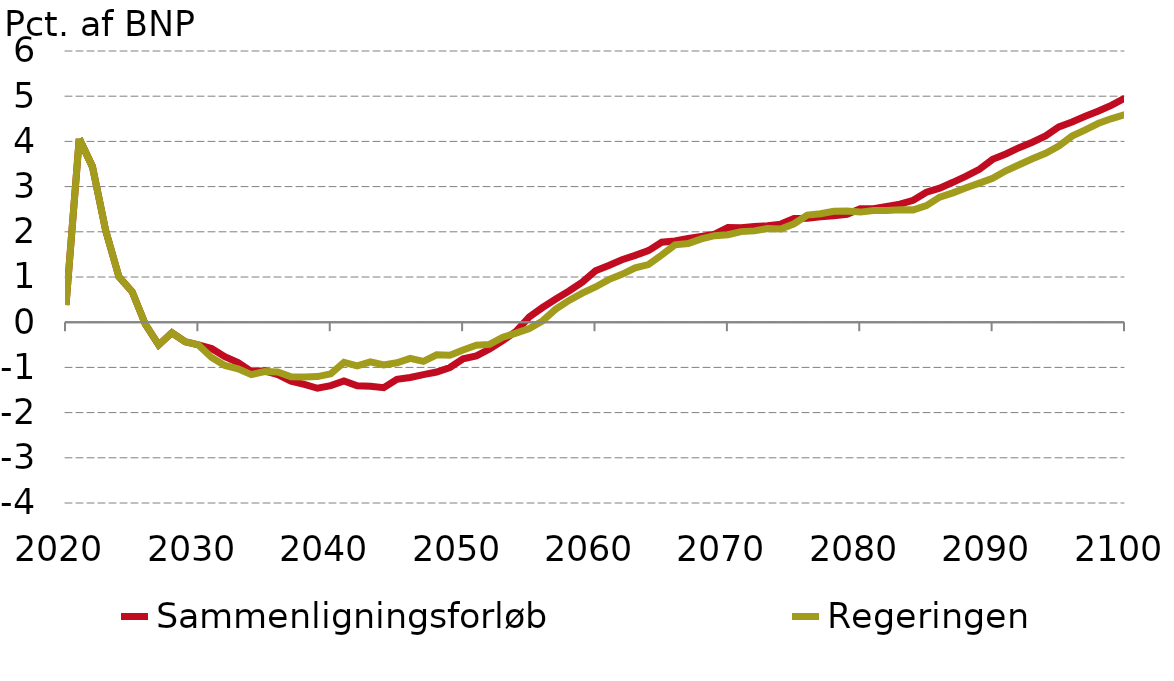
| Category |  Sammenligningsforløb |  Regeringen |
|---|---|---|
| 0 | 0.38 | 0.38 |
| 1 | 4.057 | 4.057 |
| 2 | 3.44 | 3.44 |
| 3 | 2.025 | 2.025 |
| 4 | 1.002 | 1.002 |
| 5 | 0.673 | 0.673 |
| 6 | -0.051 | -0.051 |
| 7 | -0.504 | -0.504 |
| 8 | -0.234 | -0.234 |
| 9 | -0.433 | -0.433 |
| 10 | -0.502 | -0.502 |
| 11 | -0.58 | -0.781 |
| 12 | -0.762 | -0.957 |
| 13 | -0.892 | -1.034 |
| 14 | -1.089 | -1.161 |
| 15 | -1.076 | -1.093 |
| 16 | -1.159 | -1.102 |
| 17 | -1.303 | -1.205 |
| 18 | -1.377 | -1.212 |
| 19 | -1.461 | -1.204 |
| 20 | -1.403 | -1.142 |
| 21 | -1.298 | -0.889 |
| 22 | -1.405 | -0.965 |
| 23 | -1.419 | -0.876 |
| 24 | -1.45 | -0.944 |
| 25 | -1.262 | -0.897 |
| 26 | -1.223 | -0.801 |
| 27 | -1.158 | -0.866 |
| 28 | -1.103 | -0.722 |
| 29 | -1.003 | -0.733 |
| 30 | -0.808 | -0.614 |
| 31 | -0.746 | -0.51 |
| 32 | -0.593 | -0.491 |
| 33 | -0.404 | -0.333 |
| 34 | -0.204 | -0.241 |
| 35 | 0.119 | -0.141 |
| 36 | 0.325 | 0.027 |
| 37 | 0.515 | 0.291 |
| 38 | 0.691 | 0.482 |
| 39 | 0.887 | 0.644 |
| 40 | 1.137 | 0.779 |
| 41 | 1.255 | 0.943 |
| 42 | 1.382 | 1.06 |
| 43 | 1.479 | 1.204 |
| 44 | 1.583 | 1.276 |
| 45 | 1.769 | 1.486 |
| 46 | 1.797 | 1.711 |
| 47 | 1.851 | 1.74 |
| 48 | 1.897 | 1.842 |
| 49 | 1.947 | 1.913 |
| 50 | 2.094 | 1.934 |
| 51 | 2.088 | 2.004 |
| 52 | 2.118 | 2.021 |
| 53 | 2.136 | 2.073 |
| 54 | 2.17 | 2.064 |
| 55 | 2.292 | 2.178 |
| 56 | 2.302 | 2.369 |
| 57 | 2.333 | 2.399 |
| 58 | 2.357 | 2.454 |
| 59 | 2.388 | 2.459 |
| 60 | 2.511 | 2.436 |
| 61 | 2.513 | 2.47 |
| 62 | 2.56 | 2.469 |
| 63 | 2.611 | 2.488 |
| 64 | 2.697 | 2.485 |
| 65 | 2.875 | 2.578 |
| 66 | 2.966 | 2.767 |
| 67 | 3.095 | 2.861 |
| 68 | 3.233 | 2.974 |
| 69 | 3.383 | 3.077 |
| 70 | 3.602 | 3.182 |
| 71 | 3.723 | 3.35 |
| 72 | 3.861 | 3.482 |
| 73 | 3.982 | 3.615 |
| 74 | 4.119 | 3.736 |
| 75 | 4.319 | 3.896 |
| 76 | 4.428 | 4.117 |
| 77 | 4.554 | 4.257 |
| 78 | 4.672 | 4.402 |
| 79 | 4.802 | 4.505 |
| 80 | 4.96 | 4.595 |